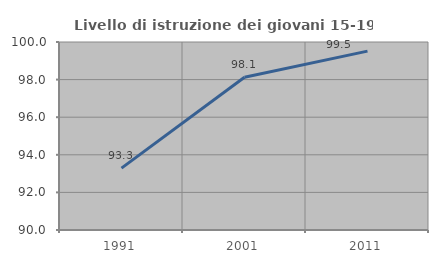
| Category | Livello di istruzione dei giovani 15-19 anni |
|---|---|
| 1991.0 | 93.293 |
| 2001.0 | 98.125 |
| 2011.0 | 99.515 |